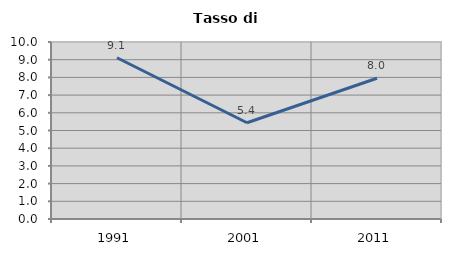
| Category | Tasso di disoccupazione   |
|---|---|
| 1991.0 | 9.112 |
| 2001.0 | 5.438 |
| 2011.0 | 7.952 |